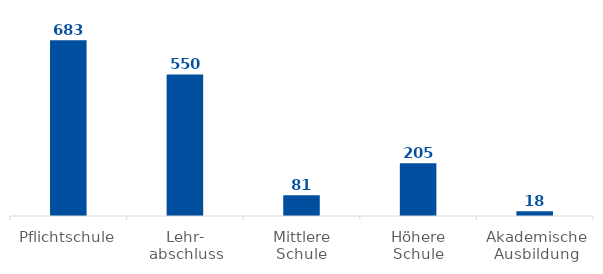
| Category | Ktn |
|---|---|
| Pflichtschule | 683 |
| Lehr-
abschluss | 550 |
| Mittlere
Schule | 81 |
| Höhere
Schule | 205 |
| Akademische
Ausbildung | 18 |